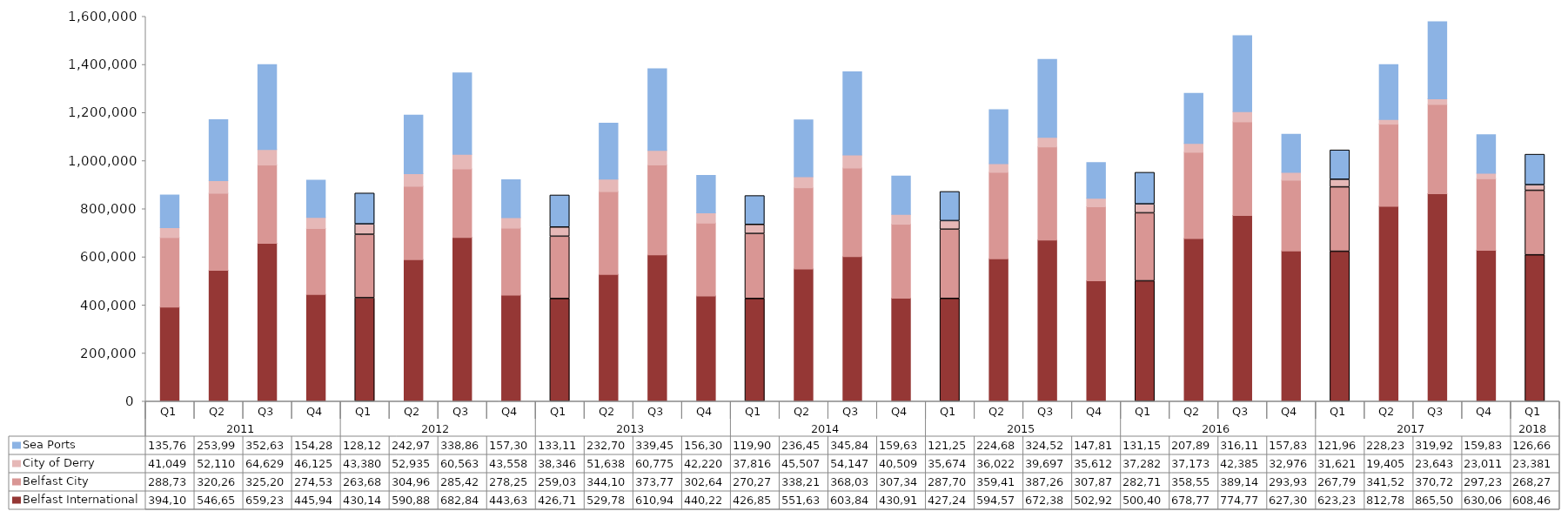
| Category | Belfast International  | Belfast City  | City of Derry | Sea Ports  |
|---|---|---|---|---|
| 0 | 394100 | 288733 | 41049 | 135765 |
| 1 | 546651 | 320268 | 52110 | 253996 |
| 2 | 659236 | 325208 | 64629 | 352634 |
| 3 | 445944 | 274534 | 46125 | 154289 |
| 4 | 430140 | 263681 | 43380 | 128126 |
| 5 | 590889 | 304966 | 52935 | 242979 |
| 6 | 682848 | 285428 | 60563 | 338862 |
| 7 | 443634 | 278255 | 43558 | 157300 |
| 8 | 426712 | 259035 | 38346 | 133115 |
| 9 | 529784 | 344108 | 51638 | 232700 |
| 10 | 610949 | 373771 | 60775 | 339454 |
| 11 | 440220 | 302642 | 42220 | 156301 |
| 12 | 426851 | 270276 | 37816 | 119908 |
| 13 | 551638 | 338216 | 45507 | 236452 |
| 14 | 603845 | 368032 | 54147 | 345849 |
| 15 | 430917 | 307349 | 40509 | 159639 |
| 16 | 427248 | 287709 | 35674 | 121250 |
| 17 | 594579 | 359411 | 36022 | 224689 |
| 18 | 672387 | 387267 | 39697 | 324526 |
| 19 | 502921 | 307873 | 35612 | 147811 |
| 20 | 500402 | 282712 | 37282 | 131151 |
| 21 | 678774 | 358552 | 37173 | 207894 |
| 22 | 774778 | 389141 | 42385 | 316118 |
| 23 | 627303 | 293936 | 32976 | 157838 |
| 24 | 623232 | 267795 | 31621 | 121961 |
| 25 | 812782 | 341528 | 19405 | 228238 |
| 26 | 865503 | 370725 | 23643 | 319921 |
| 27 | 630067 | 297235 | 23011 | 159830 |
| 28 | 608461 | 268278 | 23381 | 126669 |